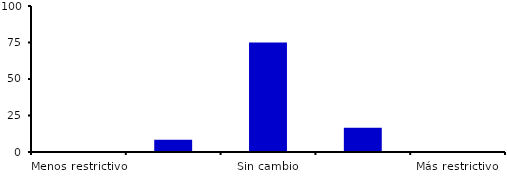
| Category | Series 0 |
|---|---|
| Menos restrictivo | 0 |
| Moderadamente menos restrictivo | 8.333 |
| Sin cambio | 75 |
| Moderadamente más restrictivo | 16.667 |
| Más restrictivo | 0 |